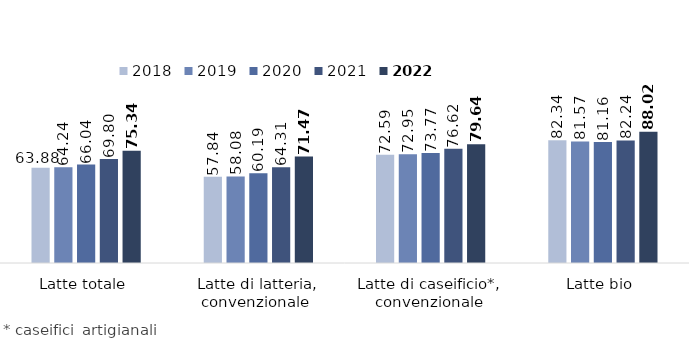
| Category | 2018 | 2019 | 2020 | 2021 | 2022 |
|---|---|---|---|---|---|
| Latte totale | 63.88 | 64.237 | 66.043 | 69.798 | 75.342 |
| Latte di latteria, convenzionale  | 57.837 | 58.081 | 60.187 | 64.31 | 71.475 |
| Latte di caseificio*, convenzionale | 72.592 | 72.945 | 73.769 | 76.62 | 79.64 |
| Latte bio | 82.343 | 81.574 | 81.157 | 82.24 | 88.024 |